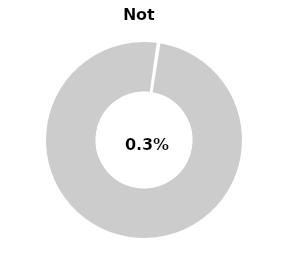
| Category | Series 0 |
|---|---|
| Not passed | 0.003 |
| Other | 0.997 |